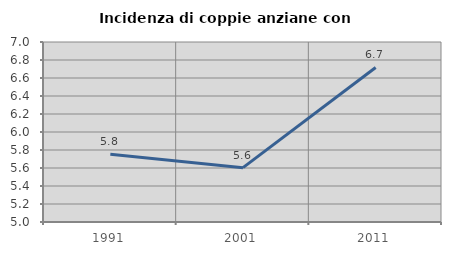
| Category | Incidenza di coppie anziane con figli |
|---|---|
| 1991.0 | 5.753 |
| 2001.0 | 5.604 |
| 2011.0 | 6.717 |